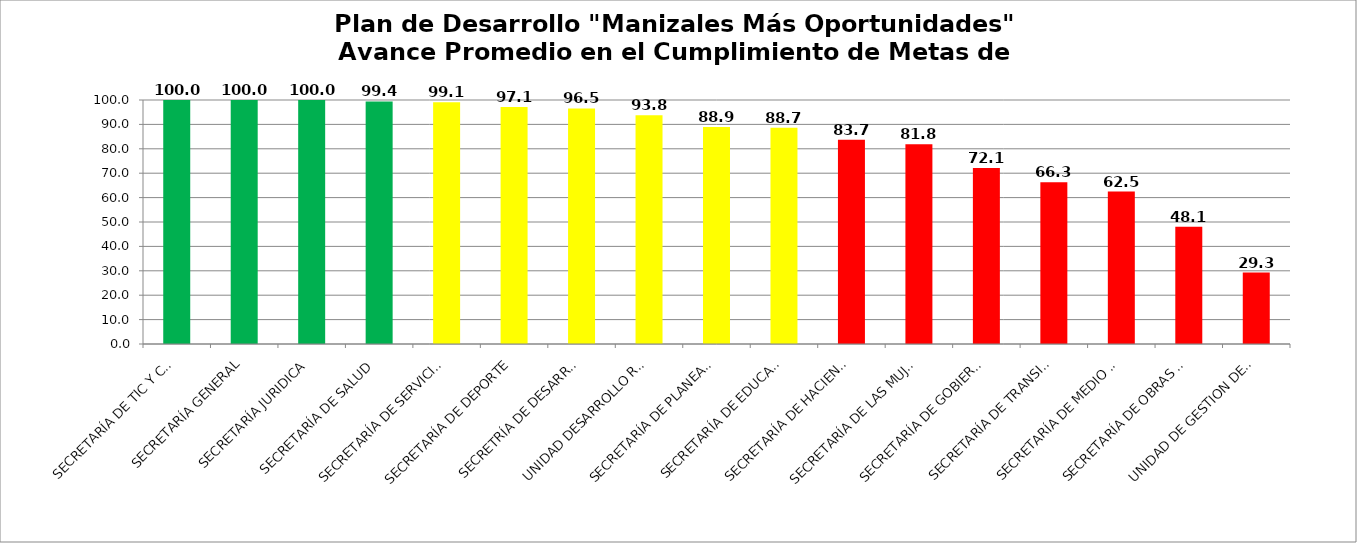
| Category | Series 0 |
|---|---|
| SECRETARÍA DE TIC Y COMPETITIVIDAD | 100 |
| SECRETARÍA GENERAL | 100 |
| SECRETARÍA JURIDICA | 100 |
| SECRETARÍA DE SALUD | 99.399 |
| SECRETARÍA DE SERVICIOS ADMINISTRATIVOS | 99.1 |
| SECRETARÍA DE DEPORTE | 97.143 |
| SECRETRÍA DE DESARROLLO SOCIAL | 96.54 |
| UNIDAD DESARROLLO RURAL | 93.75 |
| SECRETARÍA DE PLANEACIÓN | 88.885 |
| SECRETARÍA DE EDUCACIÓN | 88.673 |
| SECRETARÍA DE HACIENDA | 83.706 |
| SECRETARÍA DE LAS MUJERES Y EQUIDAD DE GÉNERO | 81.818 |
| SECRETARÍA DE GOBIERNO | 72.126 |
| SECRETARÍA DE TRANSITO Y TRANSPORTE | 66.309 |
| SECRETARÍA DE MEDIO AMBIENTE | 62.467 |
| SECRETARÍA DE OBRAS PÚBLICAS | 48.078 |
| UNIDAD DE GESTION DEL RIESGO | 29.293 |